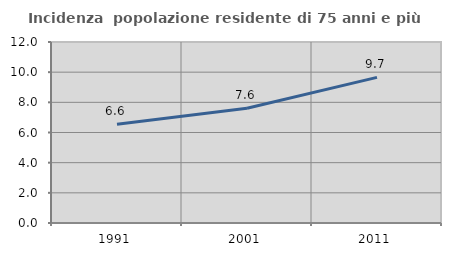
| Category | Incidenza  popolazione residente di 75 anni e più |
|---|---|
| 1991.0 | 6.554 |
| 2001.0 | 7.606 |
| 2011.0 | 9.655 |